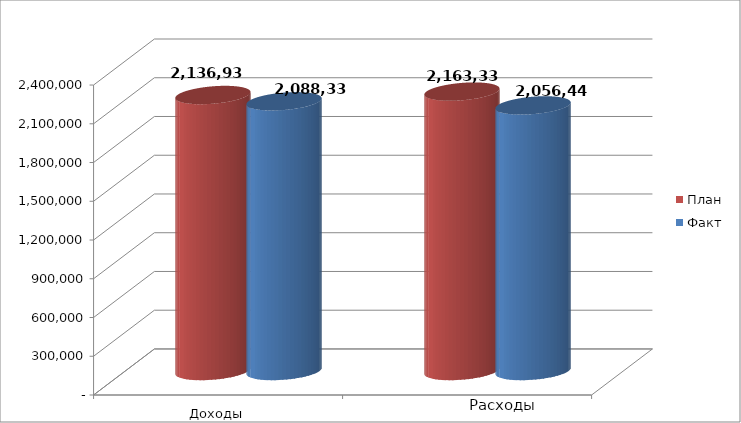
| Category | План | Факт |
|---|---|---|
| 0 | 2136934 | 2088333 |
| 1 | 2163339 | 2056441.38 |